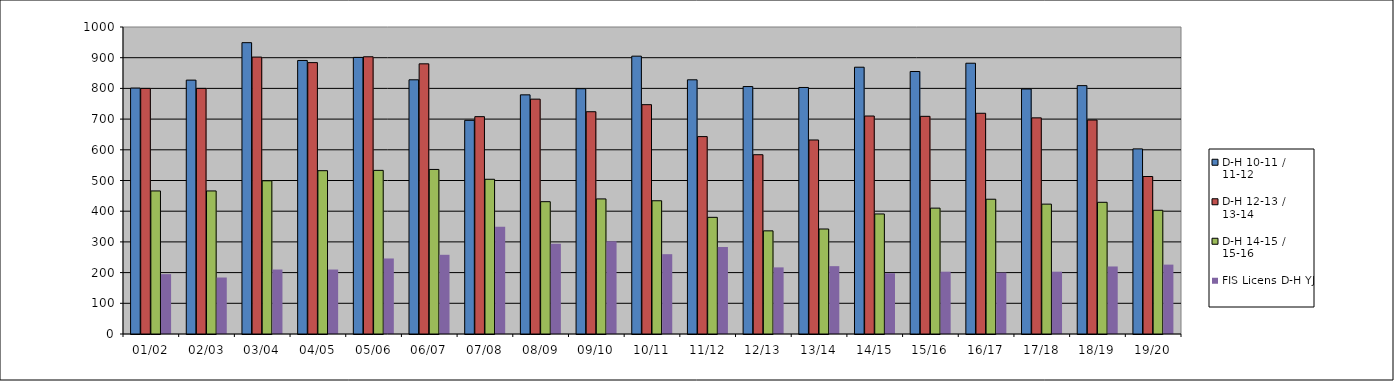
| Category | D-H 10-11 / 11-12 | D-H 12-13 / 13-14 | D-H 14-15 / 15-16 | FIS Licens D-H YJ |
|---|---|---|---|---|
| 01/02 | 801 | 800 | 466 | 195 |
| 02/03 | 827 | 800 | 466 | 184 |
| 03/04 | 949 | 902 | 499 | 210 |
| 04/05 | 891 | 884 | 532 | 210 |
| 05/06 | 901 | 903 | 533 | 246 |
| 06/07 | 828 | 880 | 536 | 258 |
| 07/08 | 696 | 708 | 504 | 349 |
| 08/09 | 779 | 765 | 431 | 294 |
| 09/10 | 799 | 724 | 440 | 302 |
| 10/11 | 905 | 747 | 434 | 260 |
| 11/12 | 828 | 643 | 380 | 283 |
| 12/13 | 806 | 584 | 336 | 217 |
| 13/14 | 803 | 632 | 342 | 221 |
| 14/15 | 869 | 710 | 391 | 198 |
| 15/16 | 855 | 709 | 410 | 203 |
| 16/17 | 882 | 719 | 439 | 200 |
| 17/18 | 798 | 704 | 423 | 203 |
| 18/19 | 809 | 697 | 429 | 220 |
| 19/20 | 603 | 513 | 403 | 226 |